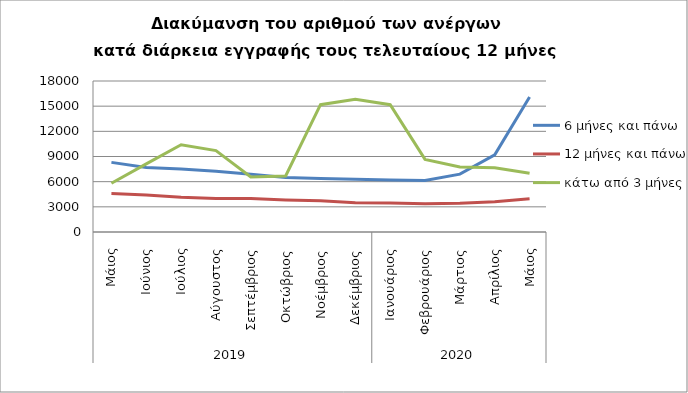
| Category | 6 μήνες και πάνω | 12 μήνες και πάνω | κάτω από 3 μήνες |
|---|---|---|---|
| 0 | 8300 | 4594 | 5815 |
| 1 | 7689 | 4420 | 8126 |
| 2 | 7497 | 4136 | 10405 |
| 3 | 7250 | 3992 | 9701 |
| 4 | 6882 | 3982 | 6563 |
| 5 | 6500 | 3821 | 6686 |
| 6 | 6379 | 3715 | 15176 |
| 7 | 6275 | 3478 | 15812 |
| 8 | 6184 | 3454 | 15175 |
| 9 | 6133 | 3369 | 8651 |
| 10 | 6894 | 3423 | 7759 |
| 11 | 9204 | 3615 | 7657 |
| 12 | 16093 | 3960 | 7009 |